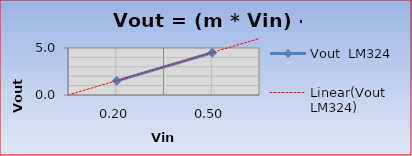
| Category | Vout  LM324 |
|---|---|
| 0.2 | 1.5 |
| 0.5 | 4.5 |